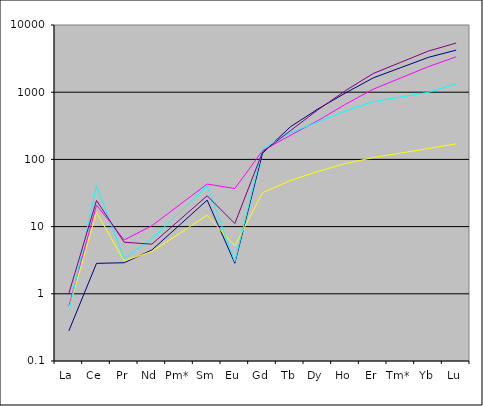
| Category | Series 0 | Series 1 | Series 2 | Series 3 | Series 4 |
|---|---|---|---|---|---|
| La | 0.28 | 0.652 | 0.588 | 0.535 | 1.008 |
| Ce | 2.839 | 20.909 | 16.289 | 40.344 | 24.466 |
| Pr | 2.898 | 6.339 | 3.098 | 3.344 | 5.854 |
| Nd | 4.482 | 10.302 | 4.257 | 6.568 | 5.476 |
| Pm* | 10.537 | 21.046 | 7.932 | 16.237 | 12.547 |
| Sm | 24.772 | 42.995 | 14.779 | 40.139 | 28.748 |
| Eu | 2.85 | 36.869 | 5.145 | 2.984 | 11.113 |
| Gd | 123.388 | 134.778 | 31.979 | 141.952 | 128.413 |
| Tb | 303.494 | 227.379 | 48.314 | 248.825 | 265.983 |
| Dy | 561.755 | 377.012 | 66.12 | 359.756 | 544.917 |
| Ho | 974.031 | 661.884 | 86.794 | 525.568 | 1055.391 |
| Er | 1630.959 | 1107.395 | 106.416 | 721.484 | 1895.33 |
| Tm* | 2321.252 | 1631.617 | 124.333 | 848.058 | 2788.075 |
| Yb | 3303.706 | 2403.997 | 145.265 | 996.838 | 4101.324 |
| Lu | 4228.312 | 3365.125 | 170.384 | 1336.236 | 5390.732 |